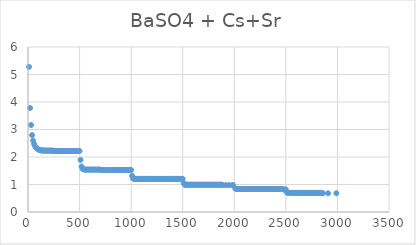
| Category | Series 0 |
|---|---|
| 9.59 | 5.278 |
| 19.64 | 3.783 |
| 29.47 | 3.163 |
| 39.53 | 2.796 |
| 49.61 | 2.599 |
| 59.42 | 2.472 |
| 69.48 | 2.387 |
| 79.42 | 2.331 |
| 89.49 | 2.303 |
| 99.43 | 2.275 |
| 109.5 | 2.26 |
| 119.43 | 2.246 |
| 129.62 | 2.246 |
| 139.55 | 2.232 |
| 149.62 | 2.232 |
| 159.44 | 2.232 |
| 169.51 | 2.232 |
| 179.44 | 2.232 |
| 189.51 | 2.232 |
| 199.45 | 2.232 |
| 209.51 | 2.232 |
| 219.45 | 2.232 |
| 229.51 | 2.232 |
| 239.45 | 2.232 |
| 249.52 | 2.218 |
| 259.58 | 2.218 |
| 269.52 | 2.218 |
| 279.58 | 2.218 |
| 289.52 | 2.218 |
| 299.47 | 2.218 |
| 309.41 | 2.218 |
| 319.48 | 2.218 |
| 329.42 | 2.218 |
| 339.49 | 2.218 |
| 349.42 | 2.218 |
| 359.6 | 2.218 |
| 369.43 | 2.218 |
| 379.49 | 2.218 |
| 389.42 | 2.218 |
| 399.49 | 2.218 |
| 409.43 | 2.218 |
| 419.61 | 2.218 |
| 429.56 | 2.218 |
| 439.61 | 2.218 |
| 449.44 | 2.218 |
| 459.5 | 2.218 |
| 469.44 | 2.218 |
| 479.62 | 2.218 |
| 489.45 | 2.218 |
| 499.63 | 2.218 |
| 509.46 | 1.894 |
| 519.44 | 1.654 |
| 529.45 | 1.57 |
| 539.46 | 1.555 |
| 549.48 | 1.541 |
| 559.44 | 1.541 |
| 569.44 | 1.541 |
| 579.46 | 1.541 |
| 589.46 | 1.541 |
| 599.48 | 1.541 |
| 609.48 | 1.541 |
| 619.44 | 1.541 |
| 629.45 | 1.541 |
| 639.46 | 1.541 |
| 649.48 | 1.541 |
| 659.48 | 1.541 |
| 669.5 | 1.541 |
| 679.45 | 1.541 |
| 689.45 | 1.541 |
| 699.47 | 1.541 |
| 709.49 | 1.527 |
| 729.45 | 1.527 |
| 739.45 | 1.527 |
| 749.47 | 1.527 |
| 759.49 | 1.527 |
| 779.45 | 1.527 |
| 789.46 | 1.527 |
| 799.47 | 1.527 |
| 809.48 | 1.527 |
| 819.44 | 1.527 |
| 829.44 | 1.527 |
| 839.46 | 1.527 |
| 849.48 | 1.527 |
| 859.49 | 1.527 |
| 869.44 | 1.527 |
| 879.44 | 1.527 |
| 889.46 | 1.527 |
| 899.46 | 1.527 |
| 909.49 | 1.527 |
| 919.43 | 1.527 |
| 929.45 | 1.527 |
| 939.46 | 1.527 |
| 949.46 | 1.527 |
| 959.48 | 1.527 |
| 969.44 | 1.527 |
| 979.44 | 1.527 |
| 989.45 | 1.527 |
| 999.46 | 1.527 |
| 1009.43 | 1.316 |
| 1019.41 | 1.217 |
| 1029.44 | 1.203 |
| 1039.43 | 1.203 |
| 1049.43 | 1.203 |
| 1059.43 | 1.203 |
| 1069.46 | 1.203 |
| 1079.41 | 1.203 |
| 1089.41 | 1.203 |
| 1099.44 | 1.203 |
| 1109.4 | 1.203 |
| 1119.43 | 1.203 |
| 1129.46 | 1.203 |
| 1139.46 | 1.203 |
| 1149.42 | 1.203 |
| 1159.41 | 1.203 |
| 1169.4 | 1.203 |
| 1179.44 | 1.203 |
| 1189.43 | 1.203 |
| 1199.43 | 1.203 |
| 1209.42 | 1.203 |
| 1219.46 | 1.203 |
| 1229.42 | 1.203 |
| 1239.45 | 1.203 |
| 1249.4 | 1.203 |
| 1259.44 | 1.203 |
| 1269.47 | 1.203 |
| 1279.43 | 1.203 |
| 1289.42 | 1.203 |
| 1299.45 | 1.203 |
| 1309.45 | 1.203 |
| 1319.48 | 1.203 |
| 1329.44 | 1.203 |
| 1339.43 | 1.203 |
| 1349.47 | 1.203 |
| 1359.46 | 1.203 |
| 1369.42 | 1.203 |
| 1379.45 | 1.203 |
| 1389.4 | 1.203 |
| 1399.4 | 1.203 |
| 1409.43 | 1.203 |
| 1419.43 | 1.203 |
| 1429.42 | 1.203 |
| 1439.46 | 1.203 |
| 1449.41 | 1.203 |
| 1459.41 | 1.203 |
| 1469.44 | 1.203 |
| 1479.48 | 1.203 |
| 1489.4 | 1.203 |
| 1499.43 | 1.203 |
| 1509.44 | 1.048 |
| 1519.43 | 0.992 |
| 1529.42 | 0.992 |
| 1539.43 | 0.992 |
| 1549.45 | 0.992 |
| 1559.41 | 0.992 |
| 1569.43 | 0.992 |
| 1579.41 | 0.992 |
| 1589.43 | 0.992 |
| 1599.42 | 0.992 |
| 1609.43 | 0.992 |
| 1619.41 | 0.992 |
| 1629.41 | 0.992 |
| 1639.42 | 0.992 |
| 1649.43 | 0.992 |
| 1659.42 | 0.992 |
| 1669.44 | 0.992 |
| 1679.42 | 0.992 |
| 1689.41 | 0.992 |
| 1699.43 | 0.992 |
| 1709.42 | 0.992 |
| 1719.43 | 0.992 |
| 1729.42 | 0.992 |
| 1739.43 | 0.992 |
| 1749.42 | 0.992 |
| 1759.44 | 0.992 |
| 1769.42 | 0.992 |
| 1779.44 | 0.992 |
| 1789.43 | 0.992 |
| 1799.44 | 0.992 |
| 1809.42 | 0.992 |
| 1819.42 | 0.992 |
| 1829.43 | 0.992 |
| 1839.41 | 0.992 |
| 1849.43 | 0.992 |
| 1859.42 | 0.992 |
| 1869.43 | 0.992 |
| 1879.43 | 0.992 |
| 1889.45 | 0.977 |
| 1919.43 | 0.977 |
| 1949.41 | 0.977 |
| 1979.41 | 0.977 |
| 1989.42 | 0.977 |
| 2009.41 | 0.851 |
| 2019.41 | 0.836 |
| 2029.42 | 0.836 |
| 2039.43 | 0.836 |
| 2049.38 | 0.836 |
| 2059.39 | 0.836 |
| 2069.43 | 0.836 |
| 2079.41 | 0.836 |
| 2089.41 | 0.836 |
| 2099.41 | 0.836 |
| 2109.4 | 0.836 |
| 2119.43 | 0.836 |
| 2129.39 | 0.836 |
| 2139.42 | 0.836 |
| 2149.43 | 0.836 |
| 2159.4 | 0.836 |
| 2169.41 | 0.836 |
| 2179.39 | 0.836 |
| 2189.42 | 0.836 |
| 2199.41 | 0.836 |
| 2209.4 | 0.836 |
| 2219.4 | 0.836 |
| 2229.39 | 0.836 |
| 2239.42 | 0.836 |
| 2249.39 | 0.836 |
| 2259.42 | 0.836 |
| 2269.4 | 0.836 |
| 2279.41 | 0.836 |
| 2289.4 | 0.836 |
| 2299.41 | 0.836 |
| 2309.39 | 0.836 |
| 2319.4 | 0.836 |
| 2329.39 | 0.836 |
| 2339.42 | 0.836 |
| 2349.41 | 0.836 |
| 2359.42 | 0.836 |
| 2369.4 | 0.836 |
| 2379.39 | 0.836 |
| 2389.39 | 0.836 |
| 2399.43 | 0.836 |
| 2409.41 | 0.836 |
| 2419.4 | 0.836 |
| 2429.39 | 0.836 |
| 2439.42 | 0.836 |
| 2449.43 | 0.836 |
| 2459.42 | 0.836 |
| 2469.4 | 0.836 |
| 2479.41 | 0.822 |
| 2499.38 | 0.822 |
| 2509.4 | 0.709 |
| 2519.42 | 0.695 |
| 2529.39 | 0.695 |
| 2549.42 | 0.695 |
| 2559.41 | 0.695 |
| 2569.4 | 0.695 |
| 2579.39 | 0.695 |
| 2589.4 | 0.695 |
| 2599.4 | 0.695 |
| 2609.4 | 0.695 |
| 2619.4 | 0.695 |
| 2629.4 | 0.695 |
| 2639.39 | 0.695 |
| 2649.38 | 0.695 |
| 2659.4 | 0.695 |
| 2669.41 | 0.695 |
| 2679.41 | 0.695 |
| 2689.39 | 0.695 |
| 2699.41 | 0.695 |
| 2709.4 | 0.695 |
| 2719.4 | 0.695 |
| 2729.4 | 0.695 |
| 2739.4 | 0.695 |
| 2749.41 | 0.695 |
| 2759.4 | 0.695 |
| 2769.4 | 0.695 |
| 2779.39 | 0.695 |
| 2789.41 | 0.695 |
| 2799.42 | 0.695 |
| 2809.41 | 0.695 |
| 2819.4 | 0.695 |
| 2829.39 | 0.695 |
| 2839.41 | 0.695 |
| 2849.4 | 0.695 |
| 2859.4 | 0.681 |
| 2909.41 | 0.681 |
| 2989.4 | 0.681 |